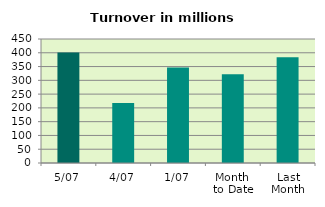
| Category | Series 0 |
|---|---|
| 5/07 | 400.928 |
| 4/07 | 217.768 |
| 1/07 | 346.346 |
| Month 
to Date | 321.681 |
| Last
Month | 384.158 |